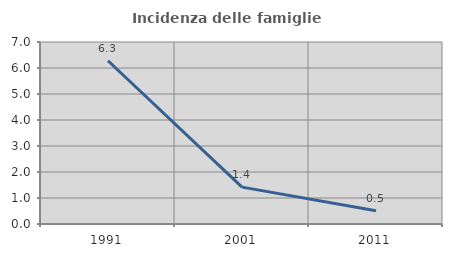
| Category | Incidenza delle famiglie numerose |
|---|---|
| 1991.0 | 6.279 |
| 2001.0 | 1.418 |
| 2011.0 | 0.51 |